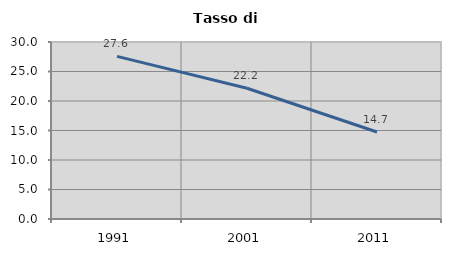
| Category | Tasso di disoccupazione   |
|---|---|
| 1991.0 | 27.563 |
| 2001.0 | 22.16 |
| 2011.0 | 14.749 |